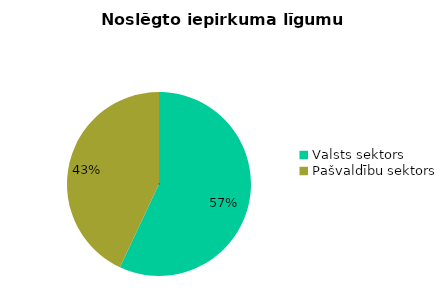
| Category | Noslēgto iepirkuma līgumu skaits |
|---|---|
| Valsts sektors | 351 |
| Pašvaldību sektors | 265 |